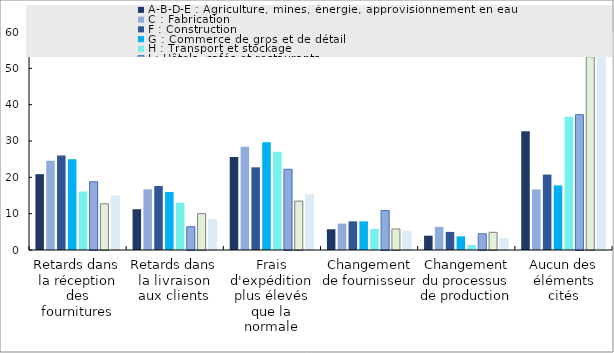
| Category | A-B-D-E : Agriculture, mines, énergie, approvisionnement en eau | C : Fabrication | F : Construction | G : Commerce de gros et de détail | H : Transport et stockage | I : Hôtels, cafés et restaurants | J : Information et communication | KTU : Autres services |
|---|---|---|---|---|---|---|---|---|
| Retards dans la réception des fournitures | 20.866 | 24.586 | 25.997 | 24.984 | 16.096 | 18.785 | 12.71 | 14.908 |
| Retards dans la livraison aux clients | 11.22 | 16.688 | 17.608 | 15.961 | 13.014 | 6.395 | 10 | 8.363 |
| Frais d'expédition plus élevés que la normale | 25.591 | 28.408 | 22.757 | 29.652 | 27.055 | 22.222 | 13.458 | 15.299 |
| Changement de fournisseur | 5.709 | 7.261 | 7.89 | 7.872 | 5.822 | 10.871 | 5.794 | 5.217 |
| Changement du processus de production | 3.937 | 6.369 | 4.983 | 3.765 | 1.37 | 4.476 | 4.86 | 3.185 |
| Aucun des éléments cités | 32.677 | 16.688 | 20.764 | 17.766 | 36.644 | 37.25 | 53.178 | 53.029 |